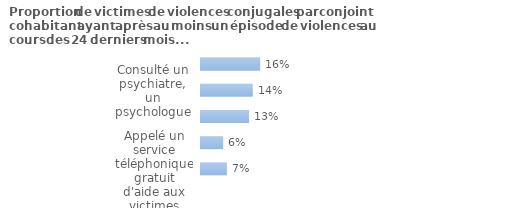
| Category | Series 0 |
|---|---|
| Appelé un service téléphonique gratuit d'aide aux victimes | 0.07 |
| Rencontré des membres d'une association d'aide aux victimes | 0.06 |
| Parlé de leur situation avec les services sociaux | 0.13 |
| Consulté un psychiatre, un psychologue | 0.14 |
| Été vues par un médecin | 0.16 |